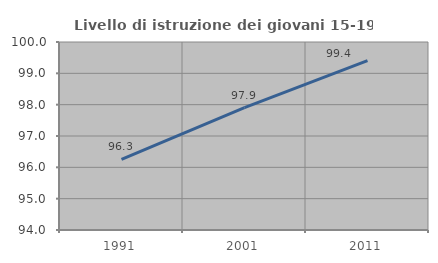
| Category | Livello di istruzione dei giovani 15-19 anni |
|---|---|
| 1991.0 | 96.254 |
| 2001.0 | 97.906 |
| 2011.0 | 99.408 |